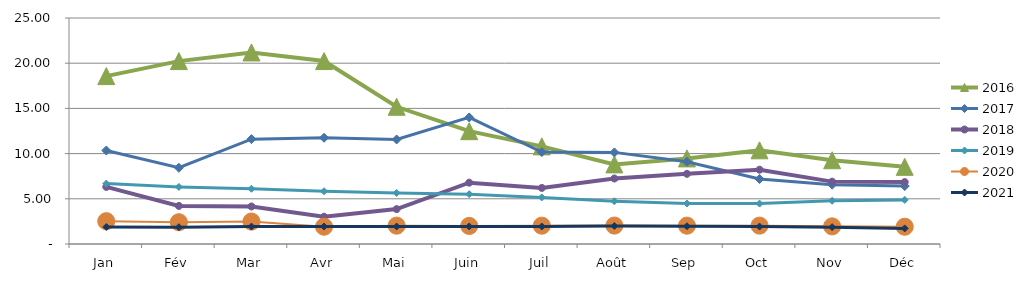
| Category | 2015 | 2016 | 2017 | 2018 | 2019 | 2020 | 2021 |
|---|---|---|---|---|---|---|---|
| Jan |  | 18.573 | 10.345 | 6.315 | 6.68 | 2.521 | 1.881 |
| Fév |  | 20.232 | 8.433 | 4.213 | 6.315 | 2.407 | 1.859 |
| Mar |  | 21.188 | 11.601 | 4.15 | 6.109 | 2.483 | 1.927 |
| Avr |  | 20.238 | 11.751 | 3.014 | 5.832 | 1.915 | 1.933 |
| Mai |  | 15.18 | 11.565 | 3.859 | 5.648 | 2.029 | 1.933 |
| Juin |  | 12.479 | 14.003 | 6.784 | 5.512 | 2.001 | 1.94 |
| Juil |  | 10.799 | 10.166 | 6.203 | 5.152 | 2.027 | 1.937 |
| Août |  | 8.807 | 10.134 | 7.245 | 4.728 | 2.036 | 1.987 |
| Sep |  | 9.47 | 9.094 | 7.761 | 4.477 | 2.029 | 1.965 |
| Oct |  | 10.362 | 7.192 | 8.218 | 4.47 | 2.032 | 1.931 |
| Nov |  | 9.261 | 6.564 | 6.9 | 4.782 | 1.95 | 1.865 |
| Déc |  | 8.534 | 6.409 | 6.846 | 4.875 | 1.91 | 1.725 |